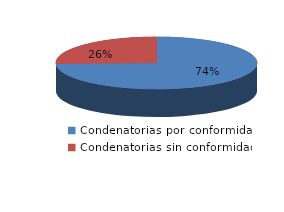
| Category | Series 0 |
|---|---|
| 0 | 1470 |
| 1 | 507 |